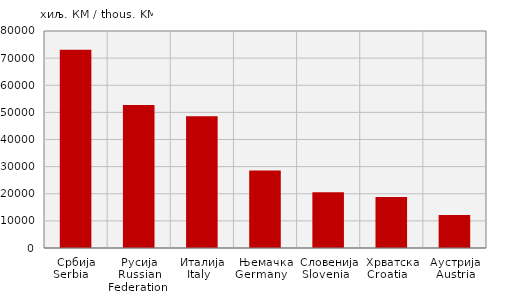
| Category | Увоз
Import |
|---|---|
| Србија
Serbia    | 73117 |
| Русија
Russian Federation  | 52686 |
| Италија
Italy   | 48590 |
| Њемачка
Germany    | 28604 |
| Словенија
Slovenia   | 20520 |
| Хрватска
Croatia    | 18758 |
| Аустрија
Austria | 12208 |